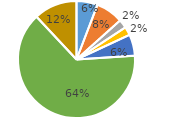
| Category | Series 0 |
|---|---|
| 0 | 0.058 |
| 1 | 0.075 |
| 2 | 0.024 |
| 3 | 0.023 |
| 4 | 0.059 |
| 5 | 0.639 |
| 6 | 0.119 |